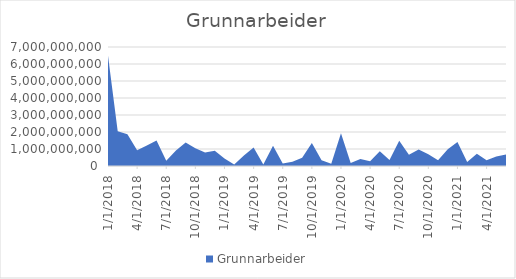
| Category | Grunnarbeider |
|---|---|
| 1/1/18 | 6490510000 |
| 2/1/18 | 2048000000 |
| 3/1/18 | 1870210000 |
| 4/1/18 | 923210000 |
| 5/1/18 | 1199080000 |
| 6/1/18 | 1495900000 |
| 7/1/18 | 305500000 |
| 8/1/18 | 908110000 |
| 9/1/18 | 1386350000 |
| 10/1/18 | 1039230000 |
| 11/1/18 | 787000000 |
| 12/1/18 | 891550000 |
| 1/1/19 | 436100000 |
| 2/1/19 | 82600000 |
| 3/1/19 | 619300000 |
| 4/1/19 | 1083150000 |
| 5/1/19 | 82750000 |
| 6/1/19 | 1191200000 |
| 7/1/19 | 140300000 |
| 8/1/19 | 243000000 |
| 9/1/19 | 489000000 |
| 10/1/19 | 1352000000 |
| 11/1/19 | 342000000 |
| 12/1/19 | 137500000 |
| 1/1/20 | 1926800000 |
| 2/1/20 | 171500000 |
| 3/1/20 | 415100000 |
| 4/1/20 | 274500000 |
| 5/1/20 | 860800000 |
| 6/1/20 | 351550000 |
| 7/1/20 | 1478100000 |
| 8/1/20 | 666060000 |
| 9/1/20 | 969295000 |
| 10/1/20 | 688200000 |
| 11/1/20 | 336600000 |
| 12/1/20 | 984500000 |
| 1/1/21 | 1417850000 |
| 2/1/21 | 229050000 |
| 3/1/21 | 713800000 |
| 4/1/21 | 337550000 |
| 5/1/21 | 564350000 |
| 6/1/21 | 681350000 |